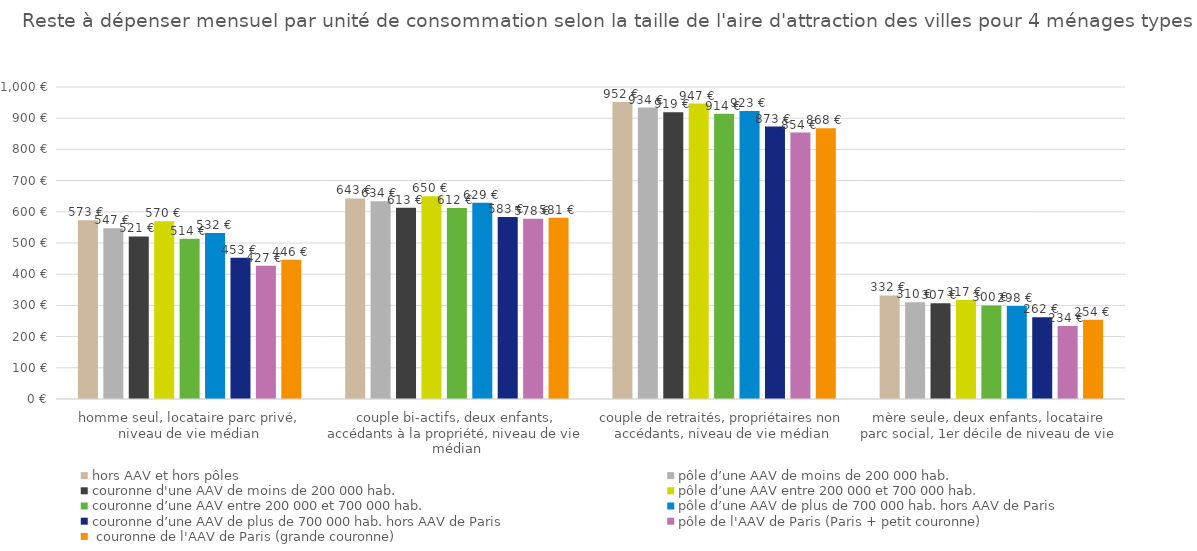
| Category | hors AAV et hors pôles | pôle d’une AAV de moins de 200 000 hab. | couronne d'une AAV de moins de 200 000 hab. | pôle d’une AAV entre 200 000 et 700 000 hab. | couronne d’une AAV entre 200 000 et 700 000 hab. | pôle d’une AAV de plus de 700 000 hab. hors AAV de Paris | couronne d’une AAV de plus de 700 000 hab. hors AAV de Paris | pôle de l'AAV de Paris (Paris + petit couronne) |  couronne de l'AAV de Paris (grande couronne) |
|---|---|---|---|---|---|---|---|---|---|
| homme seul, locataire parc privé, niveau de vie médian | 573 | 547 | 521 | 570 | 514 | 532 | 453 | 427 | 446 |
| couple bi-actifs, deux enfants, accédants à la propriété, niveau de vie médian | 643 | 634 | 613 | 650 | 612 | 629 | 583 | 578 | 581 |
| couple de retraités, propriétaires non accédants, niveau de vie médian | 952 | 934 | 919 | 947 | 914 | 923 | 873 | 854 | 868 |
| mère seule, deux enfants, locataire parc social, 1er décile de niveau de vie | 332 | 310 | 307 | 317 | 300 | 298 | 262 | 234 | 254 |